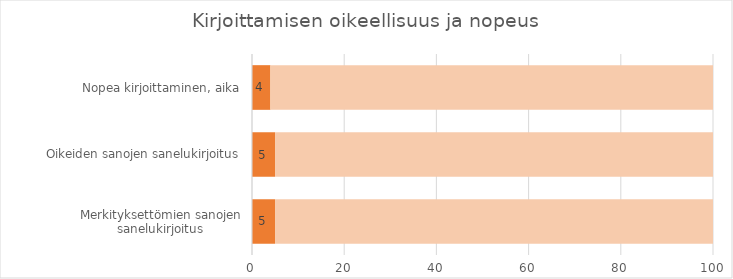
| Category | Series 0 | 95 |
|---|---|---|
| Merkityksettömien sanojen sanelukirjoitus | 5 | 95 |
| Oikeiden sanojen sanelukirjoitus | 5 | 95 |
| Nopea kirjoittaminen, aika | 4 | 96 |